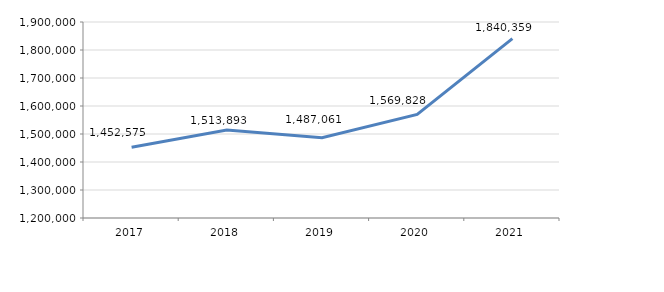
| Category | Series 0 |
|---|---|
| 2017.0 | 1452575 |
| 2018.0 | 1513893 |
| 2019.0 | 1487061.28 |
| 2020.0 | 1569828.12 |
| 2021.0 | 1840359.08 |